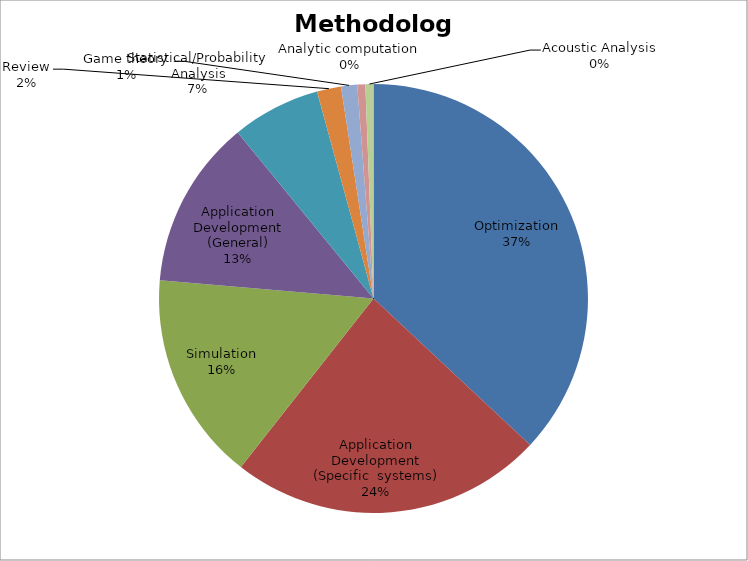
| Category | Methodology |
|---|---|
| Optimization | 0.367 |
| Application Development (Specific  systems) | 0.235 |
| Simulation | 0.157 |
| Application Development (General) | 0.127 |
| Statistical/Probability Analysis | 0.066 |
| Review | 0.018 |
| Game theory | 0.012 |
| Analytic computation | 0.006 |
| Acoustic Analysis | 0.006 |